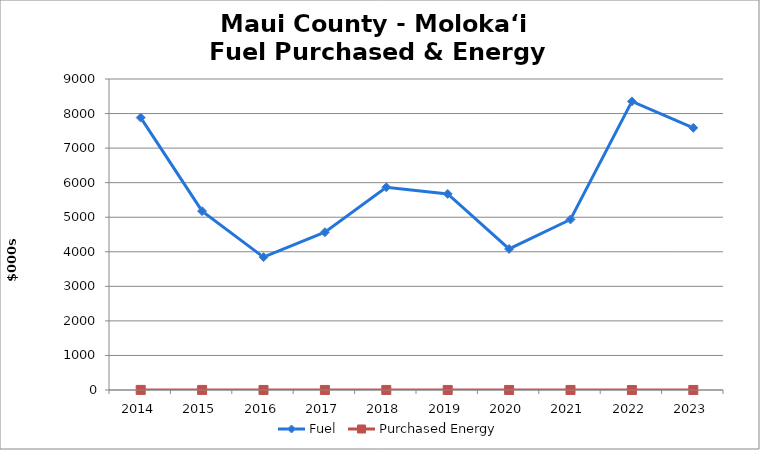
| Category | Fuel | Purchased Energy |
|---|---|---|
| 2014.0 | 7882.7 | 3 |
| 2015.0 | 5177.1 | 2 |
| 2016.0 | 3845 | 1 |
| 2017.0 | 4565.9 | 1.2 |
| 2018.0 | 5865.9 | 1.2 |
| 2019.0 | 5673.6 | 1.2 |
| 2020.0 | 4082.1 | 1.2 |
| 2021.0 | 4934.564 | 1.302 |
| 2022.0 | 8352.37 | 0.684 |
| 2023.0 | 7587.383 | 1.159 |